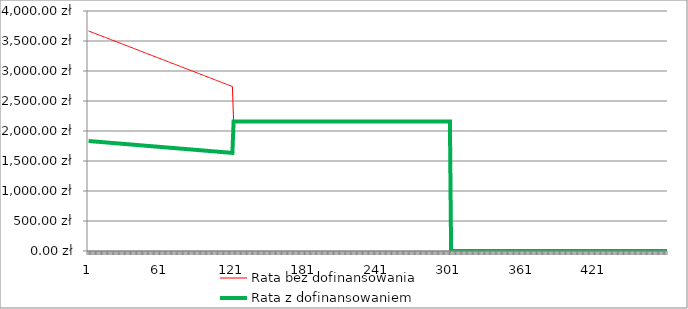
| Category | Rata bez dofinansowania | Rata z dofinansowaniem |
|---|---|---|
| 0 | 3666.67 | 1833.34 |
| 1 | 3658.9 | 1831.68 |
| 2 | 3651.12 | 1830.01 |
| 3 | 3643.34 | 1828.34 |
| 4 | 3635.56 | 1826.67 |
| 5 | 3627.78 | 1825 |
| 6 | 3620.01 | 1823.34 |
| 7 | 3612.23 | 1821.67 |
| 8 | 3604.45 | 1820.01 |
| 9 | 3596.67 | 1818.34 |
| 10 | 3588.9 | 1816.68 |
| 11 | 3581.12 | 1815.01 |
| 12 | 3573.34 | 1813.34 |
| 13 | 3565.56 | 1811.67 |
| 14 | 3557.78 | 1810 |
| 15 | 3550.01 | 1808.34 |
| 16 | 3542.23 | 1806.67 |
| 17 | 3534.45 | 1805.01 |
| 18 | 3526.67 | 1803.34 |
| 19 | 3518.89 | 1801.67 |
| 20 | 3511.12 | 1800.01 |
| 21 | 3503.34 | 1798.34 |
| 22 | 3495.56 | 1796.67 |
| 23 | 3487.78 | 1795 |
| 24 | 3480.01 | 1793.34 |
| 25 | 3472.23 | 1791.68 |
| 26 | 3464.45 | 1790.01 |
| 27 | 3456.67 | 1788.34 |
| 28 | 3448.89 | 1786.67 |
| 29 | 3441.12 | 1785.01 |
| 30 | 3433.34 | 1783.34 |
| 31 | 3425.56 | 1781.67 |
| 32 | 3417.78 | 1780 |
| 33 | 3410.01 | 1778.34 |
| 34 | 3402.23 | 1776.68 |
| 35 | 3394.45 | 1775.01 |
| 36 | 3386.67 | 1773.34 |
| 37 | 3378.89 | 1771.67 |
| 38 | 3371.12 | 1770.01 |
| 39 | 3363.34 | 1768.34 |
| 40 | 3355.56 | 1766.67 |
| 41 | 3347.78 | 1765 |
| 42 | 3340.01 | 1763.34 |
| 43 | 3332.23 | 1761.68 |
| 44 | 3324.45 | 1760.01 |
| 45 | 3316.67 | 1758.34 |
| 46 | 3308.89 | 1756.67 |
| 47 | 3301.12 | 1755.01 |
| 48 | 3293.34 | 1753.34 |
| 49 | 3285.56 | 1751.67 |
| 50 | 3277.78 | 1750 |
| 51 | 3270 | 1748.33 |
| 52 | 3262.23 | 1746.68 |
| 53 | 3254.45 | 1745.01 |
| 54 | 3246.67 | 1743.34 |
| 55 | 3238.89 | 1741.67 |
| 56 | 3231.12 | 1740.01 |
| 57 | 3223.34 | 1738.34 |
| 58 | 3215.56 | 1736.67 |
| 59 | 3207.78 | 1735 |
| 60 | 3200 | 1733.34 |
| 61 | 3192.23 | 1731.68 |
| 62 | 3184.45 | 1730.01 |
| 63 | 3176.67 | 1728.34 |
| 64 | 3168.89 | 1726.67 |
| 65 | 3161.12 | 1725.01 |
| 66 | 3153.34 | 1723.34 |
| 67 | 3145.56 | 1721.67 |
| 68 | 3137.78 | 1720 |
| 69 | 3130 | 1718.34 |
| 70 | 3122.23 | 1716.68 |
| 71 | 3114.45 | 1715.01 |
| 72 | 3106.67 | 1713.34 |
| 73 | 3098.89 | 1711.67 |
| 74 | 3091.11 | 1710 |
| 75 | 3083.34 | 1708.34 |
| 76 | 3075.56 | 1706.67 |
| 77 | 3067.78 | 1705 |
| 78 | 3060 | 1703.34 |
| 79 | 3052.23 | 1701.68 |
| 80 | 3044.45 | 1700.01 |
| 81 | 3036.67 | 1698.34 |
| 82 | 3028.89 | 1696.67 |
| 83 | 3021.11 | 1695 |
| 84 | 3013.34 | 1693.34 |
| 85 | 3005.56 | 1691.67 |
| 86 | 2997.78 | 1690 |
| 87 | 2990 | 1688.34 |
| 88 | 2982.23 | 1686.68 |
| 89 | 2974.45 | 1685.01 |
| 90 | 2966.67 | 1683.34 |
| 91 | 2958.89 | 1681.67 |
| 92 | 2951.11 | 1680 |
| 93 | 2943.34 | 1678.34 |
| 94 | 2935.56 | 1676.67 |
| 95 | 2927.78 | 1675.01 |
| 96 | 2920 | 1673.34 |
| 97 | 2912.23 | 1671.68 |
| 98 | 2904.45 | 1670.01 |
| 99 | 2896.67 | 1668.34 |
| 100 | 2888.88 | 1666.66 |
| 101 | 2881.1 | 1664.99 |
| 102 | 2873.33 | 1663.33 |
| 103 | 2865.55 | 1661.66 |
| 104 | 2857.77 | 1660 |
| 105 | 2849.99 | 1658.33 |
| 106 | 2842.22 | 1656.67 |
| 107 | 2834.44 | 1655 |
| 108 | 2826.66 | 1653.33 |
| 109 | 2818.88 | 1651.66 |
| 110 | 2811.1 | 1649.99 |
| 111 | 2803.33 | 1648.33 |
| 112 | 2795.55 | 1646.66 |
| 113 | 2787.77 | 1645 |
| 114 | 2779.99 | 1643.33 |
| 115 | 2772.22 | 1641.67 |
| 116 | 2764.44 | 1640 |
| 117 | 2756.66 | 1638.33 |
| 118 | 2748.88 | 1636.66 |
| 119 | 2741.1 | 1634.99 |
| 120 | 2157.19 | 2157.19 |
| 121 | 2157.19 | 2157.19 |
| 122 | 2157.19 | 2157.19 |
| 123 | 2157.19 | 2157.19 |
| 124 | 2157.19 | 2157.19 |
| 125 | 2157.19 | 2157.19 |
| 126 | 2157.19 | 2157.19 |
| 127 | 2157.19 | 2157.19 |
| 128 | 2157.19 | 2157.19 |
| 129 | 2157.19 | 2157.19 |
| 130 | 2157.19 | 2157.19 |
| 131 | 2157.19 | 2157.19 |
| 132 | 2157.19 | 2157.19 |
| 133 | 2157.19 | 2157.19 |
| 134 | 2157.19 | 2157.19 |
| 135 | 2157.19 | 2157.19 |
| 136 | 2157.19 | 2157.19 |
| 137 | 2157.19 | 2157.19 |
| 138 | 2157.19 | 2157.19 |
| 139 | 2157.19 | 2157.19 |
| 140 | 2157.19 | 2157.19 |
| 141 | 2157.19 | 2157.19 |
| 142 | 2157.19 | 2157.19 |
| 143 | 2157.19 | 2157.19 |
| 144 | 2157.19 | 2157.19 |
| 145 | 2157.19 | 2157.19 |
| 146 | 2157.19 | 2157.19 |
| 147 | 2157.19 | 2157.19 |
| 148 | 2157.19 | 2157.19 |
| 149 | 2157.19 | 2157.19 |
| 150 | 2157.18 | 2157.18 |
| 151 | 2157.18 | 2157.18 |
| 152 | 2157.18 | 2157.18 |
| 153 | 2157.19 | 2157.19 |
| 154 | 2157.18 | 2157.18 |
| 155 | 2157.18 | 2157.18 |
| 156 | 2157.18 | 2157.18 |
| 157 | 2157.18 | 2157.18 |
| 158 | 2157.18 | 2157.18 |
| 159 | 2157.18 | 2157.18 |
| 160 | 2157.18 | 2157.18 |
| 161 | 2157.18 | 2157.18 |
| 162 | 2157.18 | 2157.18 |
| 163 | 2157.18 | 2157.18 |
| 164 | 2157.18 | 2157.18 |
| 165 | 2157.18 | 2157.18 |
| 166 | 2157.18 | 2157.18 |
| 167 | 2157.18 | 2157.18 |
| 168 | 2157.18 | 2157.18 |
| 169 | 2157.18 | 2157.18 |
| 170 | 2157.18 | 2157.18 |
| 171 | 2157.18 | 2157.18 |
| 172 | 2157.18 | 2157.18 |
| 173 | 2157.18 | 2157.18 |
| 174 | 2157.18 | 2157.18 |
| 175 | 2157.18 | 2157.18 |
| 176 | 2157.18 | 2157.18 |
| 177 | 2157.18 | 2157.18 |
| 178 | 2157.18 | 2157.18 |
| 179 | 2157.18 | 2157.18 |
| 180 | 2157.18 | 2157.18 |
| 181 | 2157.18 | 2157.18 |
| 182 | 2157.18 | 2157.18 |
| 183 | 2157.18 | 2157.18 |
| 184 | 2157.18 | 2157.18 |
| 185 | 2157.18 | 2157.18 |
| 186 | 2157.18 | 2157.18 |
| 187 | 2157.18 | 2157.18 |
| 188 | 2157.18 | 2157.18 |
| 189 | 2157.18 | 2157.18 |
| 190 | 2157.18 | 2157.18 |
| 191 | 2157.18 | 2157.18 |
| 192 | 2157.18 | 2157.18 |
| 193 | 2157.18 | 2157.18 |
| 194 | 2157.18 | 2157.18 |
| 195 | 2157.18 | 2157.18 |
| 196 | 2157.18 | 2157.18 |
| 197 | 2157.18 | 2157.18 |
| 198 | 2157.18 | 2157.18 |
| 199 | 2157.18 | 2157.18 |
| 200 | 2157.18 | 2157.18 |
| 201 | 2157.18 | 2157.18 |
| 202 | 2157.18 | 2157.18 |
| 203 | 2157.18 | 2157.18 |
| 204 | 2157.18 | 2157.18 |
| 205 | 2157.18 | 2157.18 |
| 206 | 2157.18 | 2157.18 |
| 207 | 2157.18 | 2157.18 |
| 208 | 2157.18 | 2157.18 |
| 209 | 2157.18 | 2157.18 |
| 210 | 2157.18 | 2157.18 |
| 211 | 2157.18 | 2157.18 |
| 212 | 2157.18 | 2157.18 |
| 213 | 2157.18 | 2157.18 |
| 214 | 2157.18 | 2157.18 |
| 215 | 2157.18 | 2157.18 |
| 216 | 2157.18 | 2157.18 |
| 217 | 2157.18 | 2157.18 |
| 218 | 2157.18 | 2157.18 |
| 219 | 2157.18 | 2157.18 |
| 220 | 2157.18 | 2157.18 |
| 221 | 2157.18 | 2157.18 |
| 222 | 2157.18 | 2157.18 |
| 223 | 2157.18 | 2157.18 |
| 224 | 2157.18 | 2157.18 |
| 225 | 2157.18 | 2157.18 |
| 226 | 2157.18 | 2157.18 |
| 227 | 2157.18 | 2157.18 |
| 228 | 2157.18 | 2157.18 |
| 229 | 2157.18 | 2157.18 |
| 230 | 2157.18 | 2157.18 |
| 231 | 2157.18 | 2157.18 |
| 232 | 2157.18 | 2157.18 |
| 233 | 2157.18 | 2157.18 |
| 234 | 2157.18 | 2157.18 |
| 235 | 2157.18 | 2157.18 |
| 236 | 2157.18 | 2157.18 |
| 237 | 2157.18 | 2157.18 |
| 238 | 2157.18 | 2157.18 |
| 239 | 2157.18 | 2157.18 |
| 240 | 2157.18 | 2157.18 |
| 241 | 2157.18 | 2157.18 |
| 242 | 2157.18 | 2157.18 |
| 243 | 2157.18 | 2157.18 |
| 244 | 2157.18 | 2157.18 |
| 245 | 2157.18 | 2157.18 |
| 246 | 2157.18 | 2157.18 |
| 247 | 2157.18 | 2157.18 |
| 248 | 2157.18 | 2157.18 |
| 249 | 2157.18 | 2157.18 |
| 250 | 2157.18 | 2157.18 |
| 251 | 2157.18 | 2157.18 |
| 252 | 2157.18 | 2157.18 |
| 253 | 2157.18 | 2157.18 |
| 254 | 2157.18 | 2157.18 |
| 255 | 2157.18 | 2157.18 |
| 256 | 2157.18 | 2157.18 |
| 257 | 2157.18 | 2157.18 |
| 258 | 2157.18 | 2157.18 |
| 259 | 2157.18 | 2157.18 |
| 260 | 2157.18 | 2157.18 |
| 261 | 2157.18 | 2157.18 |
| 262 | 2157.18 | 2157.18 |
| 263 | 2157.18 | 2157.18 |
| 264 | 2157.18 | 2157.18 |
| 265 | 2157.18 | 2157.18 |
| 266 | 2157.18 | 2157.18 |
| 267 | 2157.18 | 2157.18 |
| 268 | 2157.18 | 2157.18 |
| 269 | 2157.18 | 2157.18 |
| 270 | 2157.18 | 2157.18 |
| 271 | 2157.18 | 2157.18 |
| 272 | 2157.18 | 2157.18 |
| 273 | 2157.18 | 2157.18 |
| 274 | 2157.18 | 2157.18 |
| 275 | 2157.18 | 2157.18 |
| 276 | 2157.18 | 2157.18 |
| 277 | 2157.18 | 2157.18 |
| 278 | 2157.18 | 2157.18 |
| 279 | 2157.18 | 2157.18 |
| 280 | 2157.18 | 2157.18 |
| 281 | 2157.18 | 2157.18 |
| 282 | 2157.18 | 2157.18 |
| 283 | 2157.18 | 2157.18 |
| 284 | 2157.18 | 2157.18 |
| 285 | 2157.18 | 2157.18 |
| 286 | 2157.18 | 2157.18 |
| 287 | 2157.18 | 2157.18 |
| 288 | 2157.18 | 2157.18 |
| 289 | 2157.18 | 2157.18 |
| 290 | 2157.18 | 2157.18 |
| 291 | 2157.18 | 2157.18 |
| 292 | 2157.18 | 2157.18 |
| 293 | 2157.18 | 2157.18 |
| 294 | 2157.18 | 2157.18 |
| 295 | 2157.17 | 2157.17 |
| 296 | 2157.17 | 2157.17 |
| 297 | 2157.17 | 2157.17 |
| 298 | 2157.17 | 2157.17 |
| 299 | 2157.16 | 2157.16 |
| 300 | 0 | 0 |
| 301 | 0 | 0 |
| 302 | 0 | 0 |
| 303 | 0 | 0 |
| 304 | 0 | 0 |
| 305 | 0 | 0 |
| 306 | 0 | 0 |
| 307 | 0 | 0 |
| 308 | 0 | 0 |
| 309 | 0 | 0 |
| 310 | 0 | 0 |
| 311 | 0 | 0 |
| 312 | 0 | 0 |
| 313 | 0 | 0 |
| 314 | 0 | 0 |
| 315 | 0 | 0 |
| 316 | 0 | 0 |
| 317 | 0 | 0 |
| 318 | 0 | 0 |
| 319 | 0 | 0 |
| 320 | 0 | 0 |
| 321 | 0 | 0 |
| 322 | 0 | 0 |
| 323 | 0 | 0 |
| 324 | 0 | 0 |
| 325 | 0 | 0 |
| 326 | 0 | 0 |
| 327 | 0 | 0 |
| 328 | 0 | 0 |
| 329 | 0 | 0 |
| 330 | 0 | 0 |
| 331 | 0 | 0 |
| 332 | 0 | 0 |
| 333 | 0 | 0 |
| 334 | 0 | 0 |
| 335 | 0 | 0 |
| 336 | 0 | 0 |
| 337 | 0 | 0 |
| 338 | 0 | 0 |
| 339 | 0 | 0 |
| 340 | 0 | 0 |
| 341 | 0 | 0 |
| 342 | 0 | 0 |
| 343 | 0 | 0 |
| 344 | 0 | 0 |
| 345 | 0 | 0 |
| 346 | 0 | 0 |
| 347 | 0 | 0 |
| 348 | 0 | 0 |
| 349 | 0 | 0 |
| 350 | 0 | 0 |
| 351 | 0 | 0 |
| 352 | 0 | 0 |
| 353 | 0 | 0 |
| 354 | 0 | 0 |
| 355 | 0 | 0 |
| 356 | 0 | 0 |
| 357 | 0 | 0 |
| 358 | 0 | 0 |
| 359 | 0 | 0 |
| 360 | 0 | 0 |
| 361 | 0 | 0 |
| 362 | 0 | 0 |
| 363 | 0 | 0 |
| 364 | 0 | 0 |
| 365 | 0 | 0 |
| 366 | 0 | 0 |
| 367 | 0 | 0 |
| 368 | 0 | 0 |
| 369 | 0 | 0 |
| 370 | 0 | 0 |
| 371 | 0 | 0 |
| 372 | 0 | 0 |
| 373 | 0 | 0 |
| 374 | 0 | 0 |
| 375 | 0 | 0 |
| 376 | 0 | 0 |
| 377 | 0 | 0 |
| 378 | 0 | 0 |
| 379 | 0 | 0 |
| 380 | 0 | 0 |
| 381 | 0 | 0 |
| 382 | 0 | 0 |
| 383 | 0 | 0 |
| 384 | 0 | 0 |
| 385 | 0 | 0 |
| 386 | 0 | 0 |
| 387 | 0 | 0 |
| 388 | 0 | 0 |
| 389 | 0 | 0 |
| 390 | 0 | 0 |
| 391 | 0 | 0 |
| 392 | 0 | 0 |
| 393 | 0 | 0 |
| 394 | 0 | 0 |
| 395 | 0 | 0 |
| 396 | 0 | 0 |
| 397 | 0 | 0 |
| 398 | 0 | 0 |
| 399 | 0 | 0 |
| 400 | 0 | 0 |
| 401 | 0 | 0 |
| 402 | 0 | 0 |
| 403 | 0 | 0 |
| 404 | 0 | 0 |
| 405 | 0 | 0 |
| 406 | 0 | 0 |
| 407 | 0 | 0 |
| 408 | 0 | 0 |
| 409 | 0 | 0 |
| 410 | 0 | 0 |
| 411 | 0 | 0 |
| 412 | 0 | 0 |
| 413 | 0 | 0 |
| 414 | 0 | 0 |
| 415 | 0 | 0 |
| 416 | 0 | 0 |
| 417 | 0 | 0 |
| 418 | 0 | 0 |
| 419 | 0 | 0 |
| 420 | 0 | 0 |
| 421 | 0 | 0 |
| 422 | 0 | 0 |
| 423 | 0 | 0 |
| 424 | 0 | 0 |
| 425 | 0 | 0 |
| 426 | 0 | 0 |
| 427 | 0 | 0 |
| 428 | 0 | 0 |
| 429 | 0 | 0 |
| 430 | 0 | 0 |
| 431 | 0 | 0 |
| 432 | 0 | 0 |
| 433 | 0 | 0 |
| 434 | 0 | 0 |
| 435 | 0 | 0 |
| 436 | 0 | 0 |
| 437 | 0 | 0 |
| 438 | 0 | 0 |
| 439 | 0 | 0 |
| 440 | 0 | 0 |
| 441 | 0 | 0 |
| 442 | 0 | 0 |
| 443 | 0 | 0 |
| 444 | 0 | 0 |
| 445 | 0 | 0 |
| 446 | 0 | 0 |
| 447 | 0 | 0 |
| 448 | 0 | 0 |
| 449 | 0 | 0 |
| 450 | 0 | 0 |
| 451 | 0 | 0 |
| 452 | 0 | 0 |
| 453 | 0 | 0 |
| 454 | 0 | 0 |
| 455 | 0 | 0 |
| 456 | 0 | 0 |
| 457 | 0 | 0 |
| 458 | 0 | 0 |
| 459 | 0 | 0 |
| 460 | 0 | 0 |
| 461 | 0 | 0 |
| 462 | 0 | 0 |
| 463 | 0 | 0 |
| 464 | 0 | 0 |
| 465 | 0 | 0 |
| 466 | 0 | 0 |
| 467 | 0 | 0 |
| 468 | 0 | 0 |
| 469 | 0 | 0 |
| 470 | 0 | 0 |
| 471 | 0 | 0 |
| 472 | 0 | 0 |
| 473 | 0 | 0 |
| 474 | 0 | 0 |
| 475 | 0 | 0 |
| 476 | 0 | 0 |
| 477 | 0 | 0 |
| 478 | 0 | 0 |
| 479 | 0 | 0 |